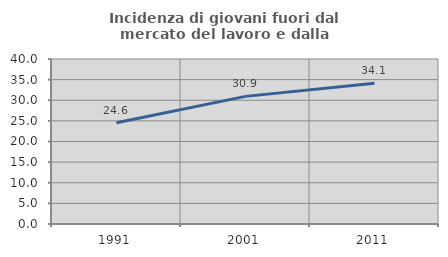
| Category | Incidenza di giovani fuori dal mercato del lavoro e dalla formazione  |
|---|---|
| 1991.0 | 24.566 |
| 2001.0 | 30.939 |
| 2011.0 | 34.132 |